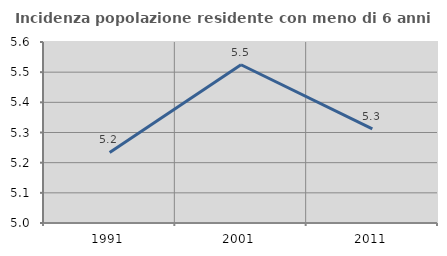
| Category | Incidenza popolazione residente con meno di 6 anni |
|---|---|
| 1991.0 | 5.234 |
| 2001.0 | 5.525 |
| 2011.0 | 5.312 |